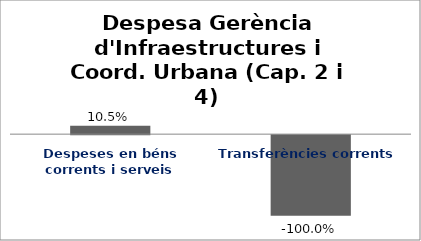
| Category | Series 0 |
|---|---|
| Despeses en béns corrents i serveis | 0.105 |
| Transferències corrents | -1 |